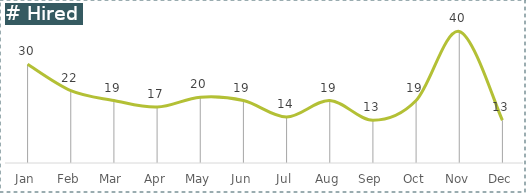
| Category | # Hired |
|---|---|
| Jan | 30 |
| Feb | 22 |
| Mar | 19 |
| Apr | 17 |
| May | 20 |
| Jun | 19 |
| Jul | 14 |
| Aug | 19 |
| Sep | 13 |
| Oct | 19 |
| Nov | 40 |
| Dec | 13 |